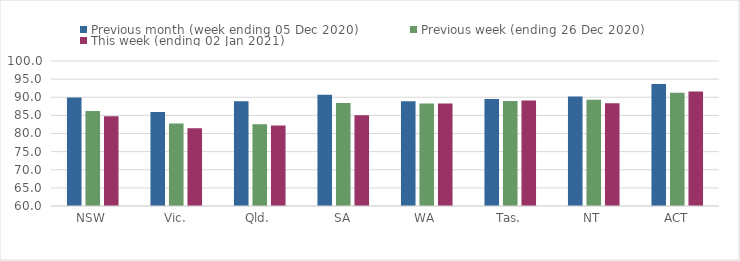
| Category | Previous month (week ending 05 Dec 2020) | Previous week (ending 26 Dec 2020) | This week (ending 02 Jan 2021) |
|---|---|---|---|
| NSW | 89.9 | 86.21 | 84.75 |
| Vic. | 85.96 | 82.76 | 81.47 |
| Qld. | 88.91 | 82.52 | 82.18 |
| SA | 90.72 | 88.43 | 85.05 |
| WA | 88.92 | 88.26 | 88.25 |
| Tas. | 89.51 | 89 | 89.13 |
| NT | 90.24 | 89.33 | 88.32 |
| ACT | 93.66 | 91.21 | 91.56 |